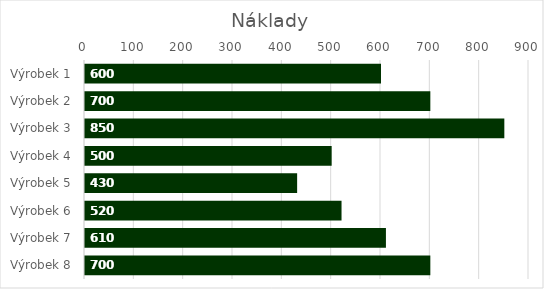
| Category | Náklady |
|---|---|
| Výrobek 1 | 600 |
| Výrobek 2 | 700 |
| Výrobek 3 | 850 |
| Výrobek 4 | 500 |
| Výrobek 5 | 430 |
| Výrobek 6 | 520 |
| Výrobek 7 | 610 |
| Výrobek 8 | 700 |